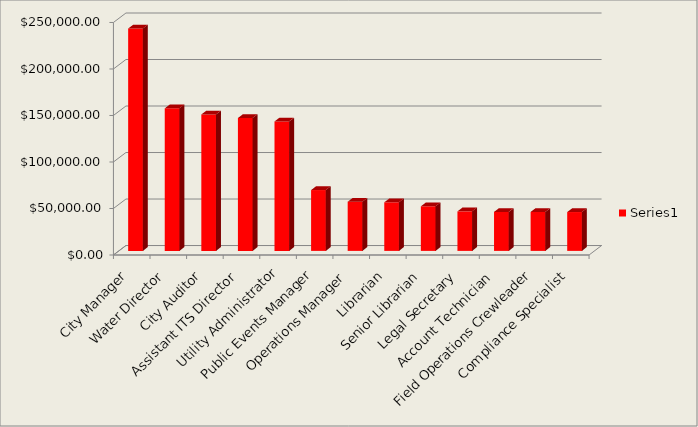
| Category | Series 0 |
|---|---|
| City Manager | 239057.725 |
| Water Director | 153240.88 |
| City Auditor | 146695.64 |
| Assistant ITS Director | 142877.595 |
| Utility Administrator | 139190.37 |
| Public Events Manager | 65418.44 |
| Operations Manager | 52862.885 |
| Librarian | 52241.28 |
| Senior Librarian | 47947.64 |
| Legal Secretary | 42505.95 |
| Account Technician | 41901.6 |
| Field Operations Crewleader | 41879.76 |
| Compliance Specialist | 41771.6 |